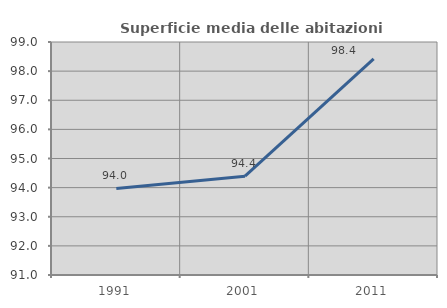
| Category | Superficie media delle abitazioni occupate |
|---|---|
| 1991.0 | 93.971 |
| 2001.0 | 94.392 |
| 2011.0 | 98.422 |